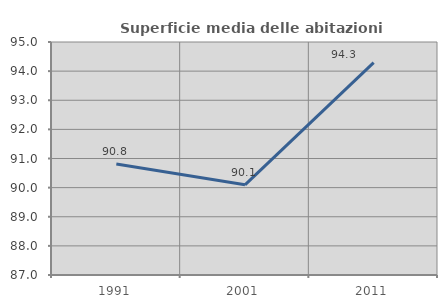
| Category | Superficie media delle abitazioni occupate |
|---|---|
| 1991.0 | 90.809 |
| 2001.0 | 90.095 |
| 2011.0 | 94.29 |